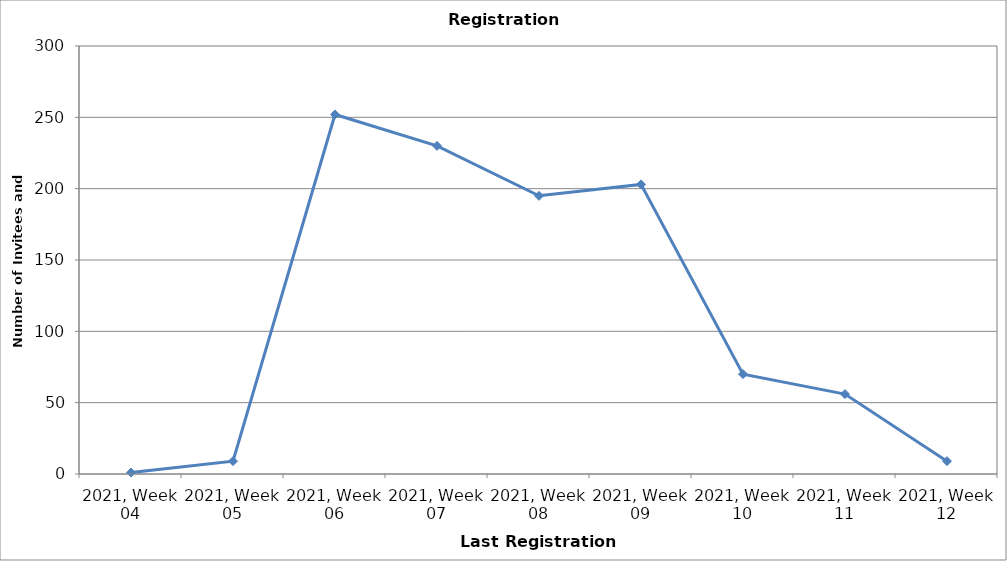
| Category | Series 0 |
|---|---|
| 2021, Week 04 | 1 |
| 2021, Week 05 | 9 |
| 2021, Week 06 | 252 |
| 2021, Week 07 | 230 |
| 2021, Week 08 | 195 |
| 2021, Week 09 | 203 |
| 2021, Week 10 | 70 |
| 2021, Week 11 | 56 |
| 2021, Week 12 | 9 |